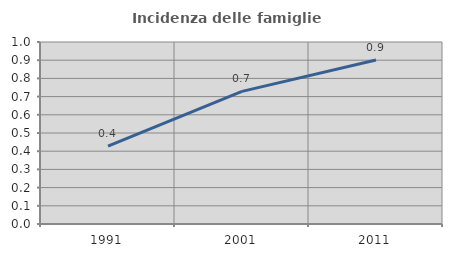
| Category | Incidenza delle famiglie numerose |
|---|---|
| 1991.0 | 0.427 |
| 2001.0 | 0.729 |
| 2011.0 | 0.901 |